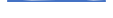
| Category | Series 0 |
|---|---|
| 0 | 22 |
| 1 | 23 |
| 2 | 10 |
| 3 | 15 |
| 4 | 18 |
| 5 | 19 |
| 6 | 26 |
| 7 | 11 |
| 8 | 21 |